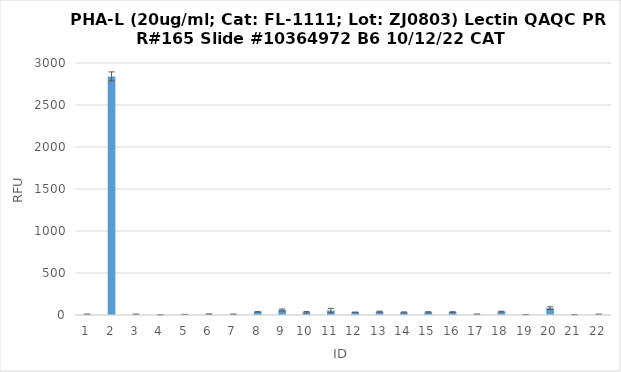
| Category | RFU |
|---|---|
| 0 | 8.75 |
| 1 | 2840.5 |
| 2 | 8.5 |
| 3 | 3.25 |
| 4 | 7 |
| 5 | 10 |
| 6 | 9 |
| 7 | 37.5 |
| 8 | 60.25 |
| 9 | 32.5 |
| 10 | 53 |
| 11 | 32.5 |
| 12 | 39.25 |
| 13 | 31 |
| 14 | 32.25 |
| 15 | 35 |
| 16 | 8.25 |
| 17 | 39.75 |
| 18 | 5 |
| 19 | 81.75 |
| 20 | 3.5 |
| 21 | 8.5 |